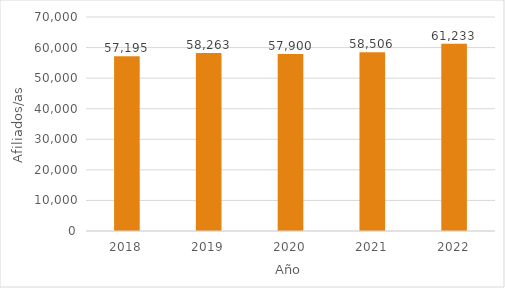
| Category | Series 0 |
|---|---|
| 2018.0 | 57195 |
| 2019.0 | 58263 |
| 2020.0 | 57900 |
| 2021.0 | 58506 |
| 2022.0 | 61233 |